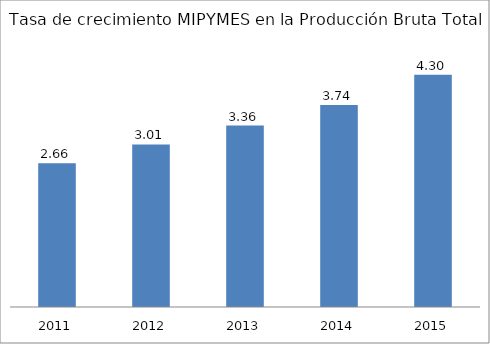
| Category | Series 0 |
|---|---|
| 2011.0 | 2.66 |
| 2012.0 | 3.01 |
| 2013.0 | 3.36 |
| 2014.0 | 3.74 |
| 2015.0 | 4.3 |